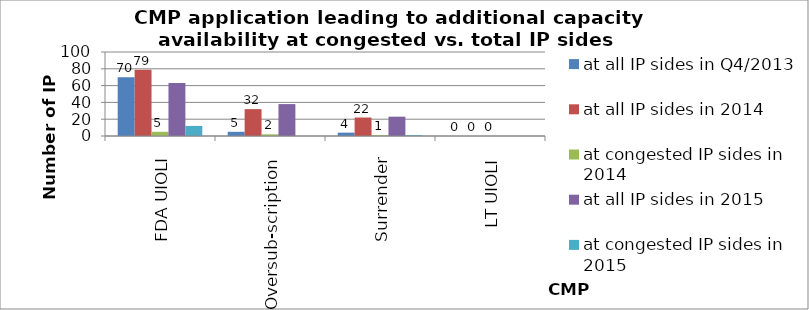
| Category | at all IP sides in Q4/2013 | at all IP sides in 2014 | at congested IP sides in 2014 | at all IP sides in 2015 | at congested IP sides in 2015 |
|---|---|---|---|---|---|
| FDA UIOLI | 70 | 79 | 5 | 63 | 12 |
| Oversub-scription | 5 | 32 | 2 | 38 | 0 |
| Surrender | 4 | 22 | 1 | 23 | 1 |
| LT UIOLI | 0 | 0 | 0 | 0 | 0 |